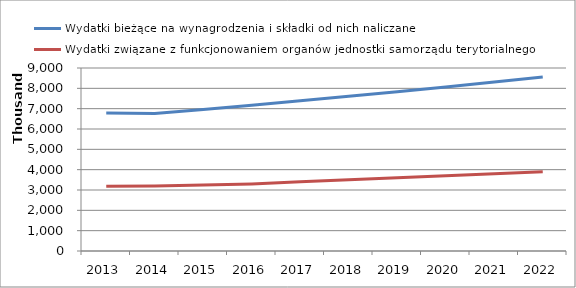
| Category | Wydatki bieżące na wynagrodzenia i składki od nich naliczane | Wydatki związane z funkcjonowaniem organów jednostki samorządu terytorialnego |
|---|---|---|
| 2013.0 | 6782288.06 | 3184091 |
| 2014.0 | 6758808 | 3200000 |
| 2015.0 | 6961573 | 3250000 |
| 2016.0 | 7170420 | 3300000 |
| 2017.0 | 7385532 | 3400000 |
| 2018.0 | 7607098 | 3500000 |
| 2019.0 | 7835311 | 3600000 |
| 2020.0 | 8070371 | 3700000 |
| 2021.0 | 8312482 | 3800000 |
| 2022.0 | 8561856 | 3900000 |